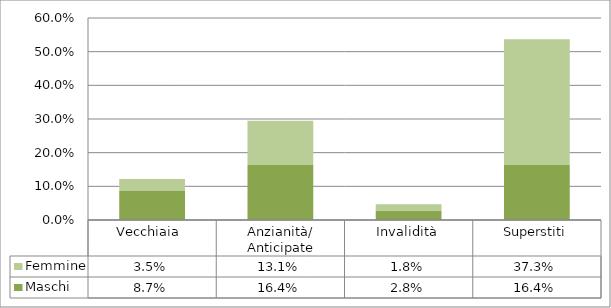
| Category | Maschi | Femmine |
|---|---|---|
| Vecchiaia  | 0.087 | 0.035 |
| Anzianità/ Anticipate | 0.164 | 0.131 |
| Invalidità | 0.028 | 0.018 |
| Superstiti | 0.164 | 0.373 |